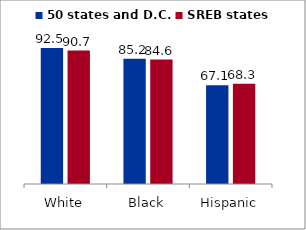
| Category | 50 states and D.C. | SREB states |
|---|---|---|
| White | 92.459 | 90.745 |
| Black | 85.244 | 84.624 |
| Hispanic | 67.113 | 68.275 |